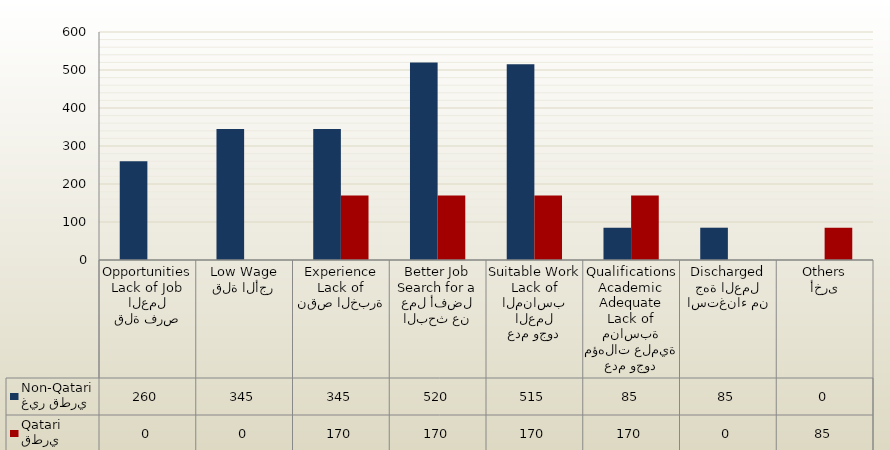
| Category | غير قطري
Non-Qatari | قطري
Qatari |
|---|---|---|
| قلة فرص العمل
Lack of Job Opportunities | 260 | 0 |
| قلة الأجر
Low Wage | 345 | 0 |
| نقص الخبرة
Lack of Experience | 345 | 170 |
| البحث عن عمل أفضل
Search for a Better Job | 520 | 170 |
| عدم وجود العمل المناسب
Lack of Suitable Work | 515 | 170 |
| عدم وجود مؤهلات علمية مناسبة
Lack of Adequate Academic Qualifications | 85 | 170 |
| استغناء من جهة العمل
Discharged | 85 | 0 |
| أخرى
Others | 0 | 85 |